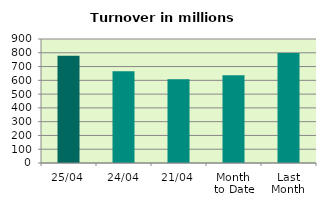
| Category | Series 0 |
|---|---|
| 25/04 | 779.245 |
| 24/04 | 666.632 |
| 21/04 | 607.644 |
| Month 
to Date | 637.675 |
| Last
Month | 798.115 |